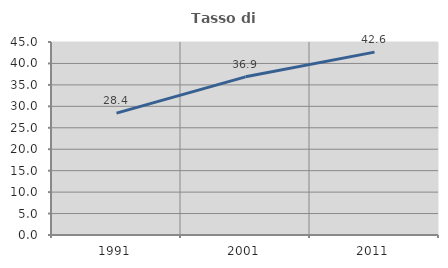
| Category | Tasso di occupazione   |
|---|---|
| 1991.0 | 28.421 |
| 2001.0 | 36.881 |
| 2011.0 | 42.645 |